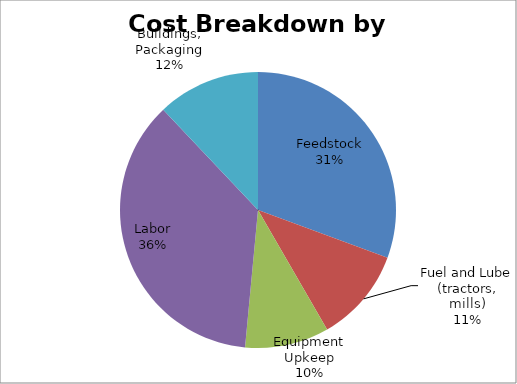
| Category | Series 0 |
|---|---|
| Feedstock | 63.529 |
| Fuel and Lube (tractors, mills) | 22.907 |
| Equipment Upkeep | 20.428 |
| Labor | 75.647 |
| Buildings, Packaging | 25 |